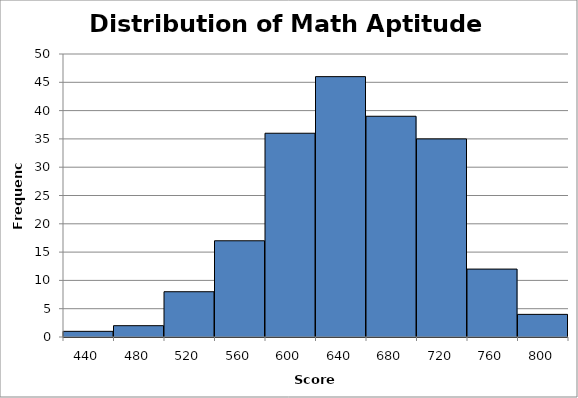
| Category | Series 0 |
|---|---|
| 440.0 | 1 |
| 480.0 | 2 |
| 520.0 | 8 |
| 560.0 | 17 |
| 600.0 | 36 |
| 640.0 | 46 |
| 680.0 | 39 |
| 720.0 | 35 |
| 760.0 | 12 |
| 800.0 | 4 |